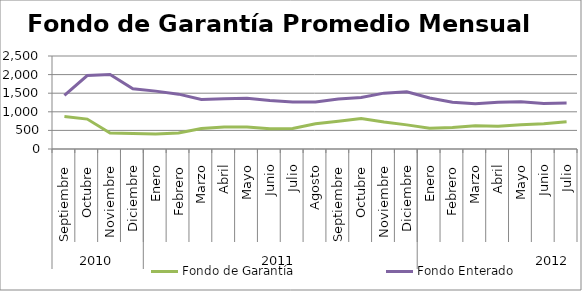
| Category | Fondo de Garantía | Fondo Enterado |
|---|---|---|
| 0 | 871.43 | 1439.553 |
| 1 | 804.208 | 1973.732 |
| 2 | 428.758 | 2004.096 |
| 3 | 417.974 | 1620.905 |
| 4 | 403.651 | 1555.632 |
| 5 | 429.02 | 1474.054 |
| 6 | 551.344 | 1328.521 |
| 7 | 591.732 | 1351.463 |
| 8 | 591.784 | 1363.301 |
| 9 | 544.875 | 1304.985 |
| 10 | 551.606 | 1265.502 |
| 11 | 679.839 | 1266.018 |
| 12 | 747.74 | 1344.929 |
| 13 | 819.75 | 1383.171 |
| 14 | 723.635 | 1501.378 |
| 15 | 648.288 | 1537.485 |
| 16 | 560.173 | 1370.992 |
| 17 | 575.916 | 1258.831 |
| 18 | 622.075 | 1216.471 |
| 19 | 612.299 | 1258.963 |
| 20 | 654.277 | 1273.362 |
| 21 | 675.965 | 1225.977 |
| 22 | 729.97 | 1235.91 |